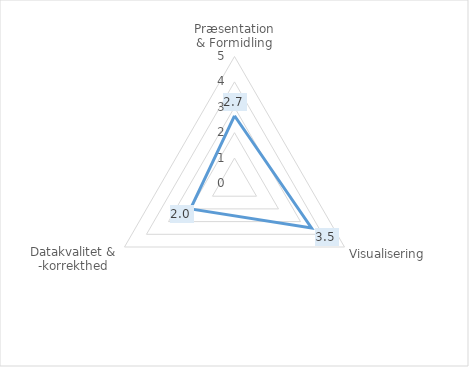
| Category | Series 0 |
|---|---|
| Præsentation & Formidling | 2.667 |
| Visualisering | 3.5 |
| Datakvalitet & -korrekthed | 2 |